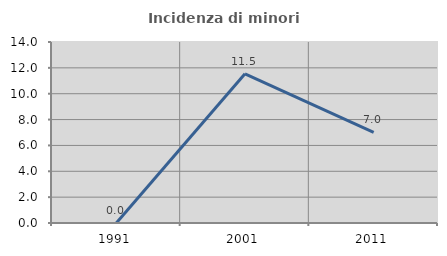
| Category | Incidenza di minori stranieri |
|---|---|
| 1991.0 | 0 |
| 2001.0 | 11.538 |
| 2011.0 | 7.018 |